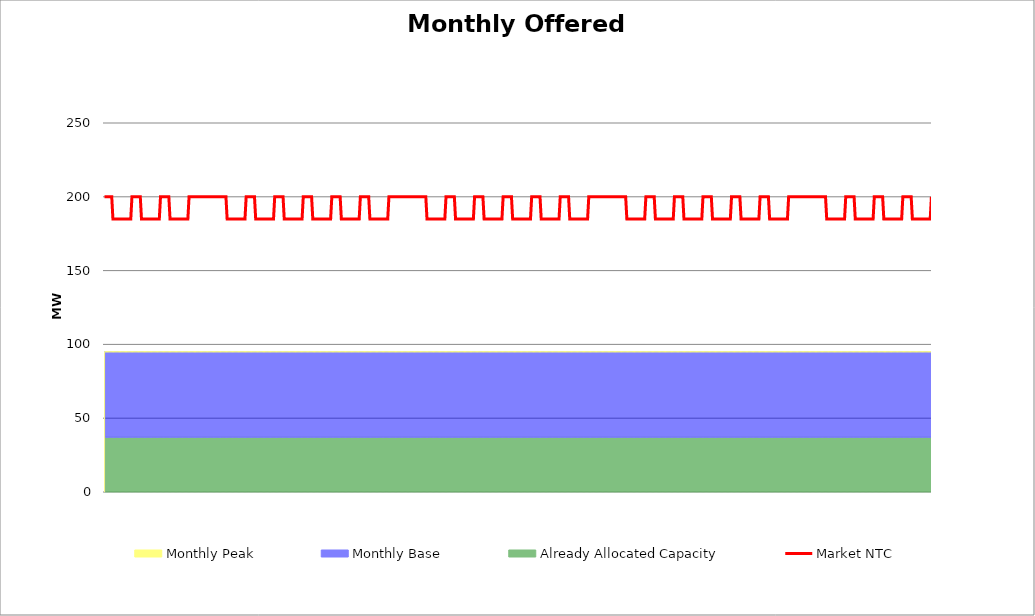
| Category | Market NTC |
|---|---|
| 0 | 200 |
| 1 | 200 |
| 2 | 200 |
| 3 | 200 |
| 4 | 200 |
| 5 | 200 |
| 6 | 200 |
| 7 | 185 |
| 8 | 185 |
| 9 | 185 |
| 10 | 185 |
| 11 | 185 |
| 12 | 185 |
| 13 | 185 |
| 14 | 185 |
| 15 | 185 |
| 16 | 185 |
| 17 | 185 |
| 18 | 185 |
| 19 | 185 |
| 20 | 185 |
| 21 | 185 |
| 22 | 185 |
| 23 | 200 |
| 24 | 200 |
| 25 | 200 |
| 26 | 200 |
| 27 | 200 |
| 28 | 200 |
| 29 | 200 |
| 30 | 200 |
| 31 | 185 |
| 32 | 185 |
| 33 | 185 |
| 34 | 185 |
| 35 | 185 |
| 36 | 185 |
| 37 | 185 |
| 38 | 185 |
| 39 | 185 |
| 40 | 185 |
| 41 | 185 |
| 42 | 185 |
| 43 | 185 |
| 44 | 185 |
| 45 | 185 |
| 46 | 185 |
| 47 | 200 |
| 48 | 200 |
| 49 | 200 |
| 50 | 200 |
| 51 | 200 |
| 52 | 200 |
| 53 | 200 |
| 54 | 200 |
| 55 | 185 |
| 56 | 185 |
| 57 | 185 |
| 58 | 185 |
| 59 | 185 |
| 60 | 185 |
| 61 | 185 |
| 62 | 185 |
| 63 | 185 |
| 64 | 185 |
| 65 | 185 |
| 66 | 185 |
| 67 | 185 |
| 68 | 185 |
| 69 | 185 |
| 70 | 185 |
| 71 | 200 |
| 72 | 200 |
| 73 | 200 |
| 74 | 200 |
| 75 | 200 |
| 76 | 200 |
| 77 | 200 |
| 78 | 200 |
| 79 | 200 |
| 80 | 200 |
| 81 | 200 |
| 82 | 200 |
| 83 | 200 |
| 84 | 200 |
| 85 | 200 |
| 86 | 200 |
| 87 | 200 |
| 88 | 200 |
| 89 | 200 |
| 90 | 200 |
| 91 | 200 |
| 92 | 200 |
| 93 | 200 |
| 94 | 200 |
| 95 | 200 |
| 96 | 200 |
| 97 | 200 |
| 98 | 200 |
| 99 | 200 |
| 100 | 200 |
| 101 | 200 |
| 102 | 200 |
| 103 | 185 |
| 104 | 185 |
| 105 | 185 |
| 106 | 185 |
| 107 | 185 |
| 108 | 185 |
| 109 | 185 |
| 110 | 185 |
| 111 | 185 |
| 112 | 185 |
| 113 | 185 |
| 114 | 185 |
| 115 | 185 |
| 116 | 185 |
| 117 | 185 |
| 118 | 185 |
| 119 | 200 |
| 120 | 200 |
| 121 | 200 |
| 122 | 200 |
| 123 | 200 |
| 124 | 200 |
| 125 | 200 |
| 126 | 200 |
| 127 | 185 |
| 128 | 185 |
| 129 | 185 |
| 130 | 185 |
| 131 | 185 |
| 132 | 185 |
| 133 | 185 |
| 134 | 185 |
| 135 | 185 |
| 136 | 185 |
| 137 | 185 |
| 138 | 185 |
| 139 | 185 |
| 140 | 185 |
| 141 | 185 |
| 142 | 185 |
| 143 | 200 |
| 144 | 200 |
| 145 | 200 |
| 146 | 200 |
| 147 | 200 |
| 148 | 200 |
| 149 | 200 |
| 150 | 200 |
| 151 | 185 |
| 152 | 185 |
| 153 | 185 |
| 154 | 185 |
| 155 | 185 |
| 156 | 185 |
| 157 | 185 |
| 158 | 185 |
| 159 | 185 |
| 160 | 185 |
| 161 | 185 |
| 162 | 185 |
| 163 | 185 |
| 164 | 185 |
| 165 | 185 |
| 166 | 185 |
| 167 | 200 |
| 168 | 200 |
| 169 | 200 |
| 170 | 200 |
| 171 | 200 |
| 172 | 200 |
| 173 | 200 |
| 174 | 200 |
| 175 | 185 |
| 176 | 185 |
| 177 | 185 |
| 178 | 185 |
| 179 | 185 |
| 180 | 185 |
| 181 | 185 |
| 182 | 185 |
| 183 | 185 |
| 184 | 185 |
| 185 | 185 |
| 186 | 185 |
| 187 | 185 |
| 188 | 185 |
| 189 | 185 |
| 190 | 185 |
| 191 | 200 |
| 192 | 200 |
| 193 | 200 |
| 194 | 200 |
| 195 | 200 |
| 196 | 200 |
| 197 | 200 |
| 198 | 200 |
| 199 | 185 |
| 200 | 185 |
| 201 | 185 |
| 202 | 185 |
| 203 | 185 |
| 204 | 185 |
| 205 | 185 |
| 206 | 185 |
| 207 | 185 |
| 208 | 185 |
| 209 | 185 |
| 210 | 185 |
| 211 | 185 |
| 212 | 185 |
| 213 | 185 |
| 214 | 185 |
| 215 | 200 |
| 216 | 200 |
| 217 | 200 |
| 218 | 200 |
| 219 | 200 |
| 220 | 200 |
| 221 | 200 |
| 222 | 200 |
| 223 | 185 |
| 224 | 185 |
| 225 | 185 |
| 226 | 185 |
| 227 | 185 |
| 228 | 185 |
| 229 | 185 |
| 230 | 185 |
| 231 | 185 |
| 232 | 185 |
| 233 | 185 |
| 234 | 185 |
| 235 | 185 |
| 236 | 185 |
| 237 | 185 |
| 238 | 185 |
| 239 | 200 |
| 240 | 200 |
| 241 | 200 |
| 242 | 200 |
| 243 | 200 |
| 244 | 200 |
| 245 | 200 |
| 246 | 200 |
| 247 | 200 |
| 248 | 200 |
| 249 | 200 |
| 250 | 200 |
| 251 | 200 |
| 252 | 200 |
| 253 | 200 |
| 254 | 200 |
| 255 | 200 |
| 256 | 200 |
| 257 | 200 |
| 258 | 200 |
| 259 | 200 |
| 260 | 200 |
| 261 | 200 |
| 262 | 200 |
| 263 | 200 |
| 264 | 200 |
| 265 | 200 |
| 266 | 200 |
| 267 | 200 |
| 268 | 200 |
| 269 | 200 |
| 270 | 200 |
| 271 | 185 |
| 272 | 185 |
| 273 | 185 |
| 274 | 185 |
| 275 | 185 |
| 276 | 185 |
| 277 | 185 |
| 278 | 185 |
| 279 | 185 |
| 280 | 185 |
| 281 | 185 |
| 282 | 185 |
| 283 | 185 |
| 284 | 185 |
| 285 | 185 |
| 286 | 185 |
| 287 | 200 |
| 288 | 200 |
| 289 | 200 |
| 290 | 200 |
| 291 | 200 |
| 292 | 200 |
| 293 | 200 |
| 294 | 200 |
| 295 | 185 |
| 296 | 185 |
| 297 | 185 |
| 298 | 185 |
| 299 | 185 |
| 300 | 185 |
| 301 | 185 |
| 302 | 185 |
| 303 | 185 |
| 304 | 185 |
| 305 | 185 |
| 306 | 185 |
| 307 | 185 |
| 308 | 185 |
| 309 | 185 |
| 310 | 185 |
| 311 | 200 |
| 312 | 200 |
| 313 | 200 |
| 314 | 200 |
| 315 | 200 |
| 316 | 200 |
| 317 | 200 |
| 318 | 200 |
| 319 | 185 |
| 320 | 185 |
| 321 | 185 |
| 322 | 185 |
| 323 | 185 |
| 324 | 185 |
| 325 | 185 |
| 326 | 185 |
| 327 | 185 |
| 328 | 185 |
| 329 | 185 |
| 330 | 185 |
| 331 | 185 |
| 332 | 185 |
| 333 | 185 |
| 334 | 185 |
| 335 | 200 |
| 336 | 200 |
| 337 | 200 |
| 338 | 200 |
| 339 | 200 |
| 340 | 200 |
| 341 | 200 |
| 342 | 200 |
| 343 | 185 |
| 344 | 185 |
| 345 | 185 |
| 346 | 185 |
| 347 | 185 |
| 348 | 185 |
| 349 | 185 |
| 350 | 185 |
| 351 | 185 |
| 352 | 185 |
| 353 | 185 |
| 354 | 185 |
| 355 | 185 |
| 356 | 185 |
| 357 | 185 |
| 358 | 185 |
| 359 | 200 |
| 360 | 200 |
| 361 | 200 |
| 362 | 200 |
| 363 | 200 |
| 364 | 200 |
| 365 | 200 |
| 366 | 200 |
| 367 | 185 |
| 368 | 185 |
| 369 | 185 |
| 370 | 185 |
| 371 | 185 |
| 372 | 185 |
| 373 | 185 |
| 374 | 185 |
| 375 | 185 |
| 376 | 185 |
| 377 | 185 |
| 378 | 185 |
| 379 | 185 |
| 380 | 185 |
| 381 | 185 |
| 382 | 185 |
| 383 | 200 |
| 384 | 200 |
| 385 | 200 |
| 386 | 200 |
| 387 | 200 |
| 388 | 200 |
| 389 | 200 |
| 390 | 200 |
| 391 | 185 |
| 392 | 185 |
| 393 | 185 |
| 394 | 185 |
| 395 | 185 |
| 396 | 185 |
| 397 | 185 |
| 398 | 185 |
| 399 | 185 |
| 400 | 185 |
| 401 | 185 |
| 402 | 185 |
| 403 | 185 |
| 404 | 185 |
| 405 | 185 |
| 406 | 185 |
| 407 | 200 |
| 408 | 200 |
| 409 | 200 |
| 410 | 200 |
| 411 | 200 |
| 412 | 200 |
| 413 | 200 |
| 414 | 200 |
| 415 | 200 |
| 416 | 200 |
| 417 | 200 |
| 418 | 200 |
| 419 | 200 |
| 420 | 200 |
| 421 | 200 |
| 422 | 200 |
| 423 | 200 |
| 424 | 200 |
| 425 | 200 |
| 426 | 200 |
| 427 | 200 |
| 428 | 200 |
| 429 | 200 |
| 430 | 200 |
| 431 | 200 |
| 432 | 200 |
| 433 | 200 |
| 434 | 200 |
| 435 | 200 |
| 436 | 200 |
| 437 | 200 |
| 438 | 200 |
| 439 | 185 |
| 440 | 185 |
| 441 | 185 |
| 442 | 185 |
| 443 | 185 |
| 444 | 185 |
| 445 | 185 |
| 446 | 185 |
| 447 | 185 |
| 448 | 185 |
| 449 | 185 |
| 450 | 185 |
| 451 | 185 |
| 452 | 185 |
| 453 | 185 |
| 454 | 185 |
| 455 | 200 |
| 456 | 200 |
| 457 | 200 |
| 458 | 200 |
| 459 | 200 |
| 460 | 200 |
| 461 | 200 |
| 462 | 200 |
| 463 | 185 |
| 464 | 185 |
| 465 | 185 |
| 466 | 185 |
| 467 | 185 |
| 468 | 185 |
| 469 | 185 |
| 470 | 185 |
| 471 | 185 |
| 472 | 185 |
| 473 | 185 |
| 474 | 185 |
| 475 | 185 |
| 476 | 185 |
| 477 | 185 |
| 478 | 185 |
| 479 | 200 |
| 480 | 200 |
| 481 | 200 |
| 482 | 200 |
| 483 | 200 |
| 484 | 200 |
| 485 | 200 |
| 486 | 200 |
| 487 | 185 |
| 488 | 185 |
| 489 | 185 |
| 490 | 185 |
| 491 | 185 |
| 492 | 185 |
| 493 | 185 |
| 494 | 185 |
| 495 | 185 |
| 496 | 185 |
| 497 | 185 |
| 498 | 185 |
| 499 | 185 |
| 500 | 185 |
| 501 | 185 |
| 502 | 185 |
| 503 | 200 |
| 504 | 200 |
| 505 | 200 |
| 506 | 200 |
| 507 | 200 |
| 508 | 200 |
| 509 | 200 |
| 510 | 200 |
| 511 | 185 |
| 512 | 185 |
| 513 | 185 |
| 514 | 185 |
| 515 | 185 |
| 516 | 185 |
| 517 | 185 |
| 518 | 185 |
| 519 | 185 |
| 520 | 185 |
| 521 | 185 |
| 522 | 185 |
| 523 | 185 |
| 524 | 185 |
| 525 | 185 |
| 526 | 185 |
| 527 | 200 |
| 528 | 200 |
| 529 | 200 |
| 530 | 200 |
| 531 | 200 |
| 532 | 200 |
| 533 | 200 |
| 534 | 200 |
| 535 | 185 |
| 536 | 185 |
| 537 | 185 |
| 538 | 185 |
| 539 | 185 |
| 540 | 185 |
| 541 | 185 |
| 542 | 185 |
| 543 | 185 |
| 544 | 185 |
| 545 | 185 |
| 546 | 185 |
| 547 | 185 |
| 548 | 185 |
| 549 | 185 |
| 550 | 185 |
| 551 | 200 |
| 552 | 200 |
| 553 | 200 |
| 554 | 200 |
| 555 | 200 |
| 556 | 200 |
| 557 | 200 |
| 558 | 200 |
| 559 | 185 |
| 560 | 185 |
| 561 | 185 |
| 562 | 185 |
| 563 | 185 |
| 564 | 185 |
| 565 | 185 |
| 566 | 185 |
| 567 | 185 |
| 568 | 185 |
| 569 | 185 |
| 570 | 185 |
| 571 | 185 |
| 572 | 185 |
| 573 | 185 |
| 574 | 185 |
| 575 | 200 |
| 576 | 200 |
| 577 | 200 |
| 578 | 200 |
| 579 | 200 |
| 580 | 200 |
| 581 | 200 |
| 582 | 200 |
| 583 | 200 |
| 584 | 200 |
| 585 | 200 |
| 586 | 200 |
| 587 | 200 |
| 588 | 200 |
| 589 | 200 |
| 590 | 200 |
| 591 | 200 |
| 592 | 200 |
| 593 | 200 |
| 594 | 200 |
| 595 | 200 |
| 596 | 200 |
| 597 | 200 |
| 598 | 200 |
| 599 | 200 |
| 600 | 200 |
| 601 | 200 |
| 602 | 200 |
| 603 | 200 |
| 604 | 200 |
| 605 | 200 |
| 606 | 200 |
| 607 | 185 |
| 608 | 185 |
| 609 | 185 |
| 610 | 185 |
| 611 | 185 |
| 612 | 185 |
| 613 | 185 |
| 614 | 185 |
| 615 | 185 |
| 616 | 185 |
| 617 | 185 |
| 618 | 185 |
| 619 | 185 |
| 620 | 185 |
| 621 | 185 |
| 622 | 185 |
| 623 | 200 |
| 624 | 200 |
| 625 | 200 |
| 626 | 200 |
| 627 | 200 |
| 628 | 200 |
| 629 | 200 |
| 630 | 200 |
| 631 | 185 |
| 632 | 185 |
| 633 | 185 |
| 634 | 185 |
| 635 | 185 |
| 636 | 185 |
| 637 | 185 |
| 638 | 185 |
| 639 | 185 |
| 640 | 185 |
| 641 | 185 |
| 642 | 185 |
| 643 | 185 |
| 644 | 185 |
| 645 | 185 |
| 646 | 185 |
| 647 | 200 |
| 648 | 200 |
| 649 | 200 |
| 650 | 200 |
| 651 | 200 |
| 652 | 200 |
| 653 | 200 |
| 654 | 200 |
| 655 | 185 |
| 656 | 185 |
| 657 | 185 |
| 658 | 185 |
| 659 | 185 |
| 660 | 185 |
| 661 | 185 |
| 662 | 185 |
| 663 | 185 |
| 664 | 185 |
| 665 | 185 |
| 666 | 185 |
| 667 | 185 |
| 668 | 185 |
| 669 | 185 |
| 670 | 185 |
| 671 | 200 |
| 672 | 200 |
| 673 | 200 |
| 674 | 200 |
| 675 | 200 |
| 676 | 200 |
| 677 | 200 |
| 678 | 200 |
| 679 | 185 |
| 680 | 185 |
| 681 | 185 |
| 682 | 185 |
| 683 | 185 |
| 684 | 185 |
| 685 | 185 |
| 686 | 185 |
| 687 | 185 |
| 688 | 185 |
| 689 | 185 |
| 690 | 185 |
| 691 | 185 |
| 692 | 185 |
| 693 | 185 |
| 694 | 185 |
| 695 | 200 |